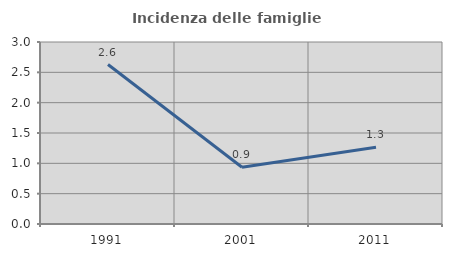
| Category | Incidenza delle famiglie numerose |
|---|---|
| 1991.0 | 2.628 |
| 2001.0 | 0.936 |
| 2011.0 | 1.265 |